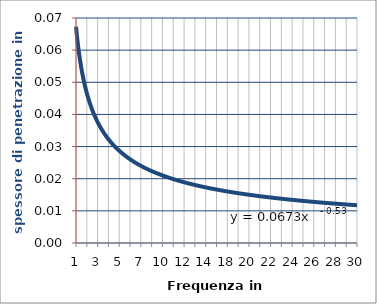
| Category | spessore di penetrazione |
|---|---|
| 1.0 | 0.065 |
| 2.0 | 0.046 |
| 3.0 | 0.038 |
| 4.0 | 0.033 |
| 5.0 | 0.029 |
| 6.0 | 0.027 |
| 7.0 | 0.025 |
| 8.0 | 0.023 |
| 10.0 | 0.021 |
| 11.0 | 0.02 |
| 12.0 | 0.019 |
| 13.0 | 0.018 |
| 14.0 | 0.017 |
| 15.0 | 0.017 |
| 18.0 | 0.015 |
| 19.0 | 0.015 |
| 20.0 | 0.015 |
| 21.0 | 0.014 |
| 22.0 | 0.014 |
| 23.0 | 0.014 |
| 24.0 | 0.013 |
| 25.0 | 0.013 |
| 26.0 | 0.013 |
| 27.0 | 0.013 |
| 28.0 | 0.012 |
| 29.0 | 0.012 |
| 30.0 | 0.012 |